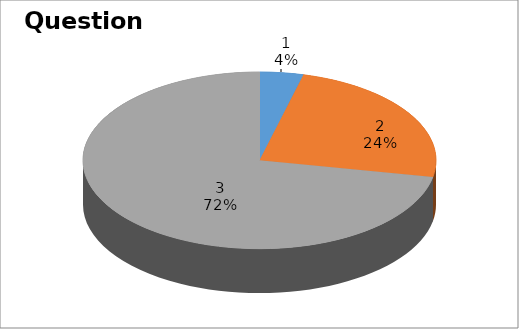
| Category | Series 0 |
|---|---|
| 0 | 1 |
| 1 | 6 |
| 2 | 18 |